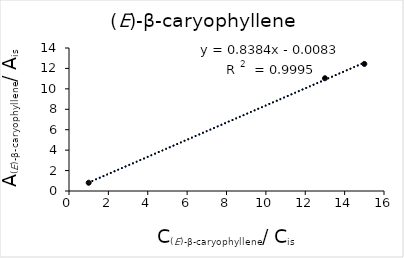
| Category | Series 0 |
|---|---|
| 1.0 | 0.809 |
| 13.0 | 11.039 |
| 15.0 | 12.441 |